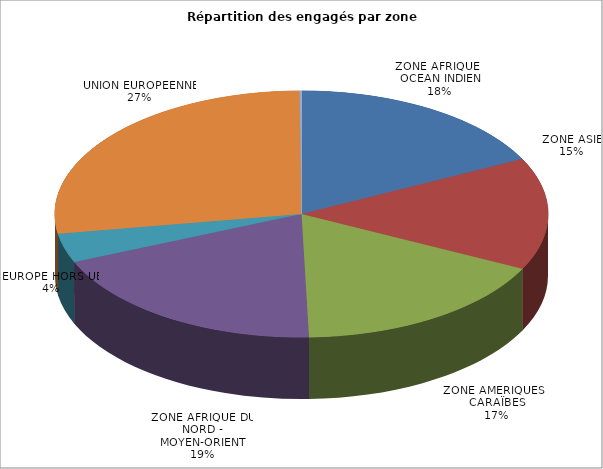
| Category | Nombre de volontaires | % |
|---|---|---|
| ZONE AFRIQUE - OCEAN INDIEN | 273 | 0.176 |
| ZONE ASIE | 228 | 0.147 |
| ZONE AMERIQUES - CARAÏBES | 266 | 0.172 |
| ZONE AFRIQUE DU NORD - MOYEN-ORIENT | 296 | 0.191 |
| EUROPE HORS UE | 59 | 0.038 |
| UNION EUROPEENNE | 425 | 0.274 |
| OCEANIE | 2 | 0.001 |